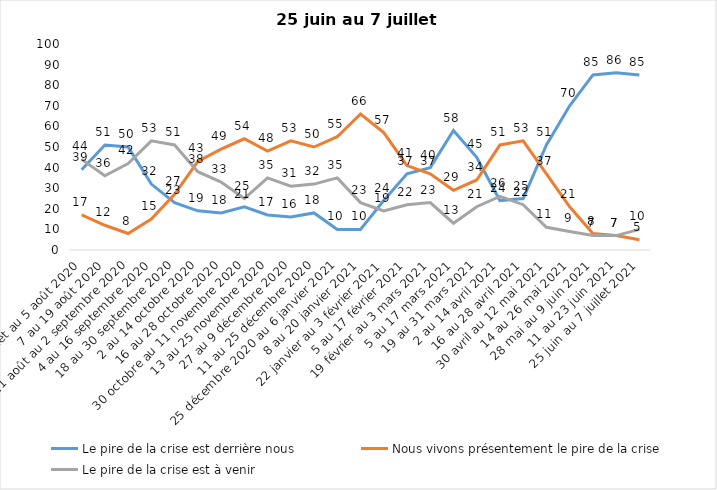
| Category | Le pire de la crise est derrière nous | Nous vivons présentement le pire de la crise | Le pire de la crise est à venir |
|---|---|---|---|
| 24 juillet au 5 août 2020 | 39 | 17 | 44 |
| 7 au 19 août 2020 | 51 | 12 | 36 |
| 21 août au 2 septembre 2020 | 50 | 8 | 42 |
| 4 au 16 septembre 2020 | 32 | 15 | 53 |
| 18 au 30 septembre 2020 | 23 | 27 | 51 |
| 2 au 14 octobre 2020 | 19 | 43 | 38 |
| 16 au 28 octobre 2020 | 18 | 49 | 33 |
| 30 octobre au 11 novembre 2020 | 21 | 54 | 25 |
| 13 au 25 novembre 2020 | 17 | 48 | 35 |
| 27 au 9 décembre 2020 | 16 | 53 | 31 |
| 11 au 25 décembre 2020 | 18 | 50 | 32 |
| 25 décembre 2020 au 6 janvier 2021 | 10 | 55 | 35 |
| 8 au 20 janvier 2021 | 10 | 66 | 23 |
| 22 janvier au 3 février 2021 | 24 | 57 | 19 |
| 5 au 17 février 2021 | 37 | 41 | 22 |
| 19 février au 3 mars 2021 | 40 | 37 | 23 |
| 5 au 17 mars 2021 | 58 | 29 | 13 |
| 19 au 31 mars 2021 | 45 | 34 | 21 |
| 2 au 14 avril 2021 | 24 | 51 | 26 |
| 16 au 28 avril 2021 | 25 | 53 | 22 |
| 30 avril au 12 mai 2021 | 51 | 37 | 11 |
| 14 au 26 mai 2021 | 70 | 21 | 9 |
| 28 mai au 9 juin 2021 | 85 | 8 | 7 |
| 11 au 23 juin 2021 | 86 | 7 | 7 |
| 25 juin au 7 juillet 2021 | 85 | 5 | 10 |